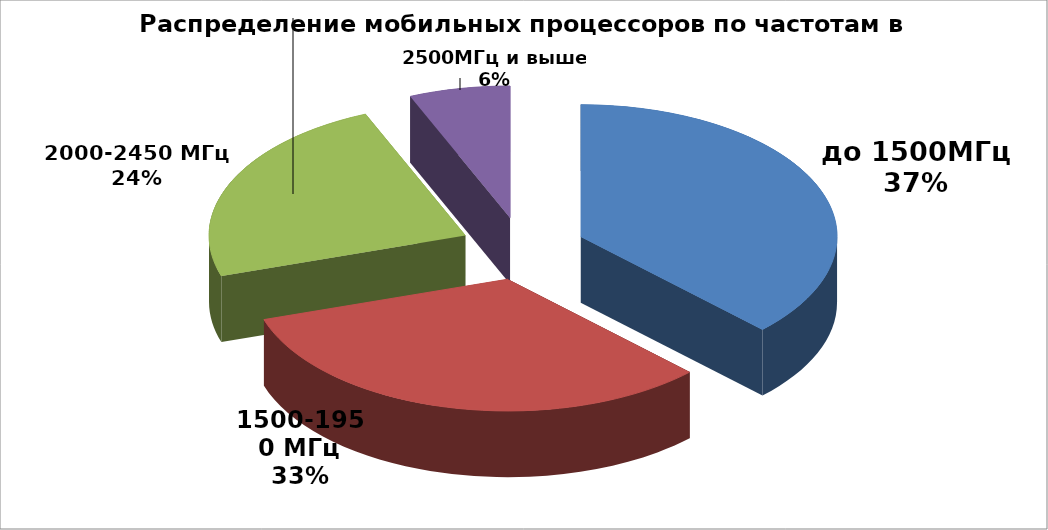
| Category | Series 0 |
|---|---|
| до 1500МГц | 100 |
| 1500-1950 МГц | 87 |
| 2000-2450 МГц | 63 |
| 2500МГц и выше | 17 |